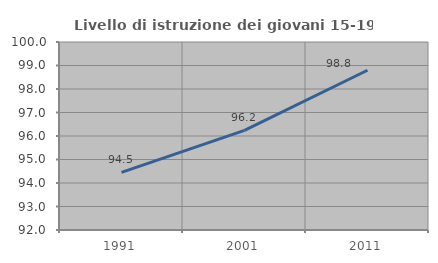
| Category | Livello di istruzione dei giovani 15-19 anni |
|---|---|
| 1991.0 | 94.454 |
| 2001.0 | 96.241 |
| 2011.0 | 98.798 |